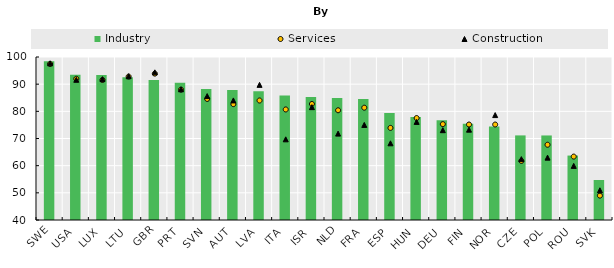
| Category | Industry |
|---|---|
| SWE | 98.4 |
| USA | 93.45 |
| LUX | 93.33 |
| LTU | 92.59 |
| GBR | 91.5 |
| PRT | 90.53 |
| SVN | 88.21 |
| AUT | 87.88 |
| LVA | 87.43 |
| ITA | 85.84 |
| ISR | 85.314 |
| NLD | 84.93 |
| FRA | 84.55 |
| ESP | 79.37 |
| HUN | 77.91 |
| DEU | 76.71 |
| FIN | 75.39 |
| NOR | 74.45 |
| CZE | 71.14 |
| POL | 71.12 |
| ROU | 63.72 |
| SVK | 54.73 |